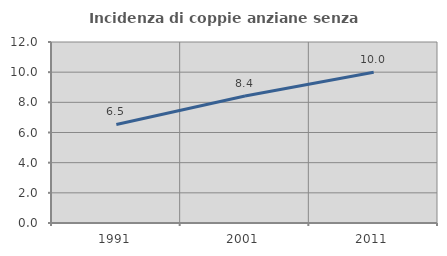
| Category | Incidenza di coppie anziane senza figli  |
|---|---|
| 1991.0 | 6.533 |
| 2001.0 | 8.42 |
| 2011.0 | 9.989 |